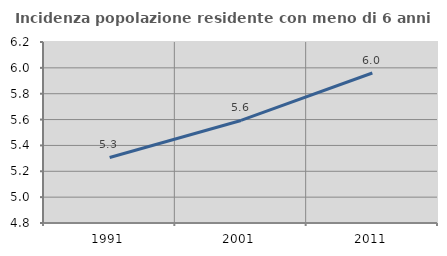
| Category | Incidenza popolazione residente con meno di 6 anni |
|---|---|
| 1991.0 | 5.307 |
| 2001.0 | 5.593 |
| 2011.0 | 5.96 |